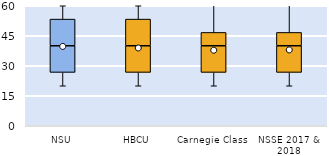
| Category | 25th | 50th | 75th |
|---|---|---|---|
| NSU | 26.667 | 13.333 | 13.333 |
| HBCU | 26.667 | 13.333 | 13.333 |
| Carnegie Class | 26.667 | 13.333 | 6.667 |
| NSSE 2017 & 2018 | 26.667 | 13.333 | 6.667 |